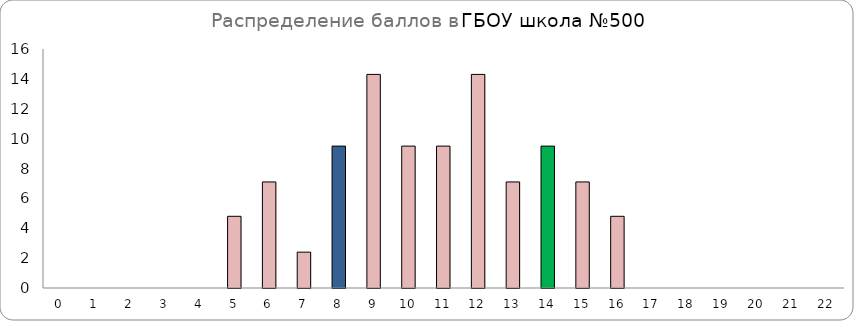
| Category | Series 0 |
|---|---|
| 0.0 | 0 |
| 1.0 | 0 |
| 2.0 | 0 |
| 3.0 | 0 |
| 4.0 | 0 |
| 5.0 | 4.8 |
| 6.0 | 7.1 |
| 7.0 | 2.4 |
| 8.0 | 9.5 |
| 9.0 | 14.3 |
| 10.0 | 9.5 |
| 11.0 | 9.5 |
| 12.0 | 14.3 |
| 13.0 | 7.1 |
| 14.0 | 9.5 |
| 15.0 | 7.1 |
| 16.0 | 4.8 |
| 17.0 | 0 |
| 18.0 | 0 |
| 19.0 | 0 |
| 20.0 | 0 |
| 21.0 | 0 |
| 22.0 | 0 |